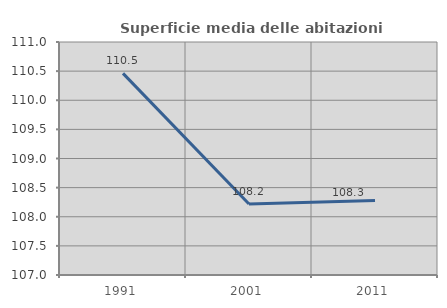
| Category | Superficie media delle abitazioni occupate |
|---|---|
| 1991.0 | 110.461 |
| 2001.0 | 108.219 |
| 2011.0 | 108.278 |